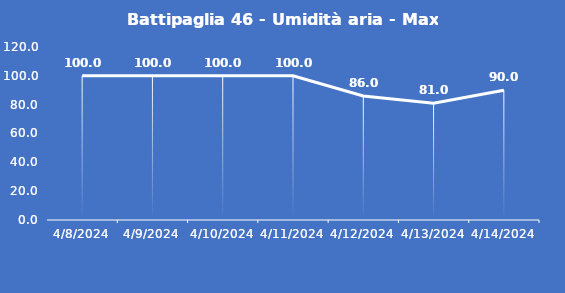
| Category | Battipaglia 46 - Umidità aria - Max (%) |
|---|---|
| 4/8/24 | 100 |
| 4/9/24 | 100 |
| 4/10/24 | 100 |
| 4/11/24 | 100 |
| 4/12/24 | 86 |
| 4/13/24 | 81 |
| 4/14/24 | 90 |